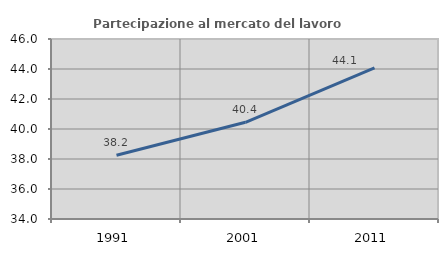
| Category | Partecipazione al mercato del lavoro  femminile |
|---|---|
| 1991.0 | 38.248 |
| 2001.0 | 40.449 |
| 2011.0 | 44.069 |